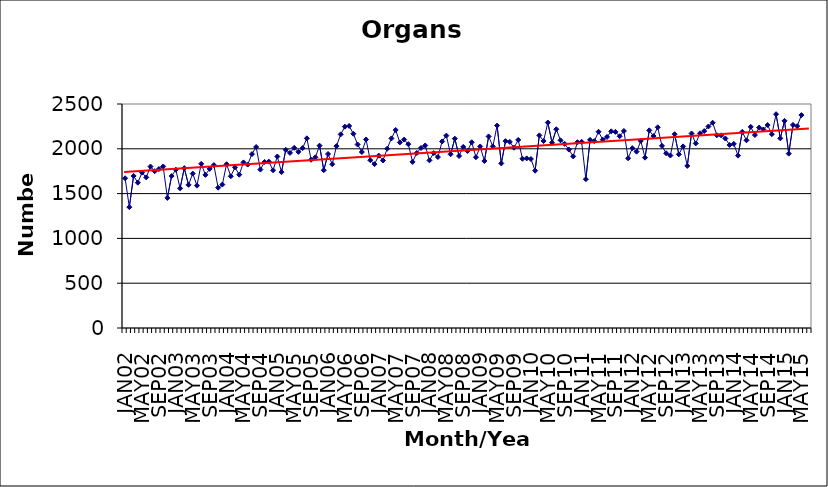
| Category | Series 0 |
|---|---|
| JAN02 | 1671 |
| FEB02 | 1349 |
| MAR02 | 1697 |
| APR02 | 1622 |
| MAY02 | 1734 |
| JUN02 | 1681 |
| JUL02 | 1802 |
| AUG02 | 1750 |
| SEP02 | 1774 |
| OCT02 | 1803 |
| NOV02 | 1452 |
| DEC02 | 1696 |
| JAN03 | 1767 |
| FEB03 | 1559 |
| MAR03 | 1784 |
| APR03 | 1598 |
| MAY03 | 1723 |
| JUN03 | 1589 |
| JUL03 | 1832 |
| AUG03 | 1709 |
| SEP03 | 1776 |
| OCT03 | 1818 |
| NOV03 | 1566 |
| DEC03 | 1601 |
| JAN04 | 1828 |
| FEB04 | 1694 |
| MAR04 | 1793 |
| APR04 | 1711 |
| MAY04 | 1848 |
| JUN04 | 1824 |
| JUL04 | 1941 |
| AUG04 | 2020 |
| SEP04 | 1768 |
| OCT04 | 1853 |
| NOV04 | 1857 |
| DEC04 | 1760 |
| JAN05 | 1914 |
| FEB05 | 1740 |
| MAR05 | 1989 |
| APR05 | 1954 |
| MAY05 | 2011 |
| JUN05 | 1966 |
| JUL05 | 2008 |
| AUG05 | 2117 |
| SEP05 | 1878 |
| OCT05 | 1905 |
| NOV05 | 2035 |
| DEC05 | 1761 |
| JAN06 | 1942 |
| FEB06 | 1828 |
| MAR06 | 2030 |
| APR06 | 2161 |
| MAY06 | 2247 |
| JUN06 | 2255 |
| JUL06 | 2168 |
| AUG06 | 2048 |
| SEP06 | 1964 |
| OCT06 | 2104 |
| NOV06 | 1873 |
| DEC06 | 1829 |
| JAN07 | 1924 |
| FEB07 | 1870 |
| MAR07 | 2001 |
| APR07 | 2116 |
| MAY07 | 2210 |
| JUN07 | 2071 |
| JUL07 | 2103 |
| AUG07 | 2052 |
| SEP07 | 1854 |
| OCT07 | 1953 |
| NOV07 | 2009 |
| DEC07 | 2037 |
| JAN08 | 1871 |
| FEB08 | 1952 |
| MAR08 | 1908 |
| APR08 | 2082 |
| MAY08 | 2147 |
| JUN08 | 1939 |
| JUL08 | 2113 |
| AUG08 | 1920 |
| SEP08 | 2021 |
| OCT08 | 1976 |
| NOV08 | 2073 |
| DEC08 | 1906 |
| JAN09 | 2026 |
| FEB09 | 1864 |
| MAR09 | 2138 |
| APR09 | 2027 |
| MAY09 | 2259 |
| JUN09 | 1837 |
| JUL09 | 2086 |
| AUG09 | 2077 |
| SEP09 | 2012 |
| OCT09 | 2099 |
| NOV09 | 1889 |
| DEC09 | 1893 |
| JAN10 | 1886 |
| FEB10 | 1756 |
| MAR10 | 2150 |
| APR10 | 2087 |
| MAY10 | 2293 |
| JUN10 | 2068 |
| JUL10 | 2218 |
| AUG10 | 2095 |
| SEP10 | 2054 |
| OCT10 | 1991 |
| NOV10 | 1915 |
| DEC10 | 2073 |
| JAN11 | 2078 |
| FEB11 | 1661 |
| MAR11 | 2100 |
| APR11 | 2086 |
| MAY11 | 2190 |
| JUN11 | 2102 |
| JUL11 | 2132 |
| AUG11 | 2195 |
| SEP11 | 2189 |
| OCT11 | 2140 |
| NOV11 | 2199 |
| DEC11 | 1894 |
| JAN12 | 2007 |
| FEB12 | 1968 |
| MAR12 | 2088 |
| APR12 | 1901 |
| MAY12 | 2206 |
| JUN12 | 2142 |
| JUL12 | 2240 |
| AUG12 | 2033 |
| SEP12 | 1950 |
| OCT12 | 1925 |
| NOV12 | 2163 |
| DEC12 | 1938 |
| JAN13 | 2027 |
| FEB13 | 1809 |
| MAR13 | 2171 |
| APR13 | 2060 |
| MAY13 | 2173 |
| JUN13 | 2198 |
| JUL13 | 2249 |
| AUG13 | 2291 |
| SEP13 | 2151 |
| OCT13 | 2150 |
| NOV13 | 2115 |
| DEC13 | 2043 |
| JAN14 | 2055 |
| FEB14 | 1924 |
| MAR14 | 2189 |
| APR14 | 2095 |
| MAY14 | 2245 |
| JUN14 | 2154 |
| JUL14 | 2237 |
| AUG14 | 2216 |
| SEP14 | 2265 |
| OCT14 | 2163 |
| NOV14 | 2386 |
| DEC14 | 2117 |
| JAN15 | 2312 |
| FEB15 | 1946 |
| MAR15 | 2266 |
| APR15 | 2253 |
| MAY15 | 2376 |